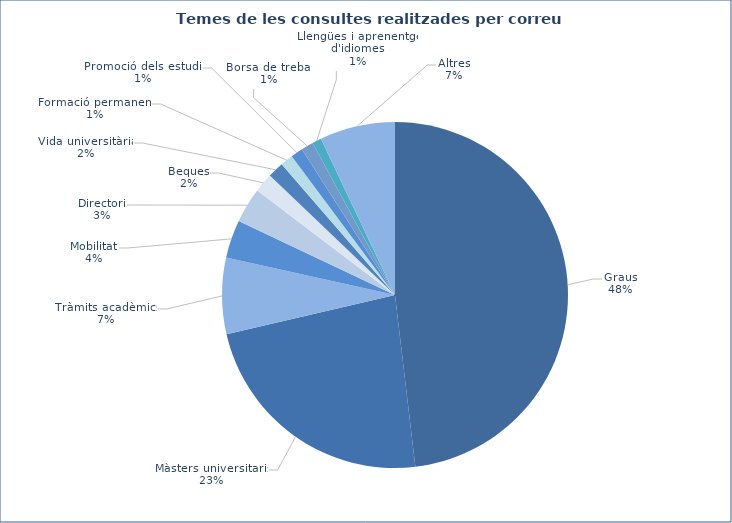
| Category | Series 0 |
|---|---|
| Graus | 2112 |
| Màsters universitaris | 1020 |
| Tràmits acadèmics | 312 |
| Mobilitat | 157 |
| Directori | 144 |
| Beques | 79 |
| Vida universitària | 66 |
| Formació permanent | 52 |
| Promoció dels estudis | 50 |
| Borsa de treball | 50 |
| Llengües i aprenentge d'idiomes | 38 |
| Altres | 309 |